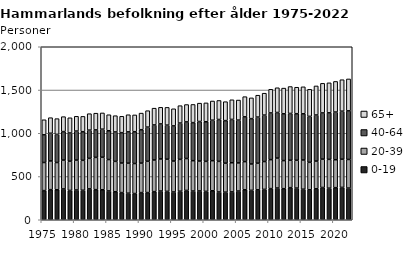
| Category | 0-19 | 20-39 | 40-64 | 65+ |
|---|---|---|---|---|
| 1975.0 | 337 | 325 | 320 | 174 |
| 1976.0 | 348 | 332 | 320 | 180 |
| 1977.0 | 347 | 315 | 325 | 182 |
| 1978.0 | 356 | 334 | 329 | 173 |
| 1979.0 | 339 | 338 | 326 | 176 |
| 1980.0 | 344 | 346 | 335 | 171 |
| 1981.0 | 341 | 346 | 331 | 177 |
| 1982.0 | 357 | 353 | 326 | 190 |
| 1983.0 | 348 | 373 | 318 | 193 |
| 1984.0 | 347 | 376 | 324 | 188 |
| 1985.0 | 333 | 363 | 333 | 185 |
| 1986.0 | 324 | 351 | 340 | 188 |
| 1987.0 | 314 | 342 | 351 | 189 |
| 1988.0 | 307 | 347 | 362 | 198 |
| 1989.0 | 303 | 347 | 368 | 194 |
| 1990.0 | 314 | 341 | 386 | 192 |
| 1991.0 | 314 | 362 | 395 | 190 |
| 1992.0 | 325 | 366 | 405 | 194 |
| 1993.0 | 332 | 371 | 405 | 192 |
| 1994.0 | 328 | 372 | 394 | 205 |
| 1995.0 | 321 | 358 | 406 | 198 |
| 1996.0 | 330 | 368 | 420 | 201 |
| 1997.0 | 339 | 369 | 423 | 201 |
| 1998.0 | 332 | 351 | 440 | 210 |
| 1999.0 | 333 | 346 | 457 | 212 |
| 2000.0 | 328 | 347 | 458 | 218 |
| 2001.0 | 335 | 348 | 468 | 222 |
| 2002.0 | 321 | 354 | 484 | 220 |
| 2003.0 | 319 | 335 | 492 | 219 |
| 2004.0 | 322 | 337 | 501 | 227 |
| 2005.0 | 332 | 325 | 495 | 232 |
| 2006.0 | 347 | 325 | 518 | 233 |
| 2007.0 | 340 | 305 | 524 | 240 |
| 2008.0 | 346 | 308 | 533 | 253 |
| 2009.0 | 351 | 322 | 537 | 253 |
| 2010.0 | 360 | 335 | 540 | 273 |
| 2011.0 | 367 | 346 | 527 | 286 |
| 2012.0 | 359 | 325 | 541 | 297 |
| 2013.0 | 371 | 317 | 541 | 311 |
| 2014.0 | 366 | 322 | 538 | 306 |
| 2015.0 | 353 | 338 | 534 | 312 |
| 2016.0 | 346 | 318 | 531 | 313 |
| 2017.0 | 358 | 320 | 533 | 336 |
| 2018.0 | 373 | 328 | 534 | 342 |
| 2019.0 | 365 | 333 | 538 | 347 |
| 2020.0 | 371 | 323 | 551 | 354 |
| 2021.0 | 374 | 326 | 555 | 364 |
| 2022.0 | 366 | 331 | 562 | 369 |